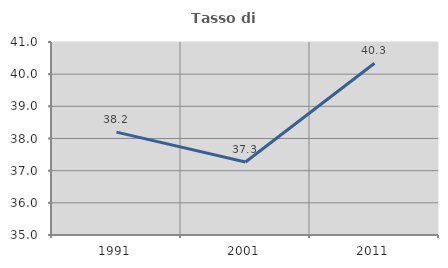
| Category | Tasso di occupazione   |
|---|---|
| 1991.0 | 38.197 |
| 2001.0 | 37.27 |
| 2011.0 | 40.34 |